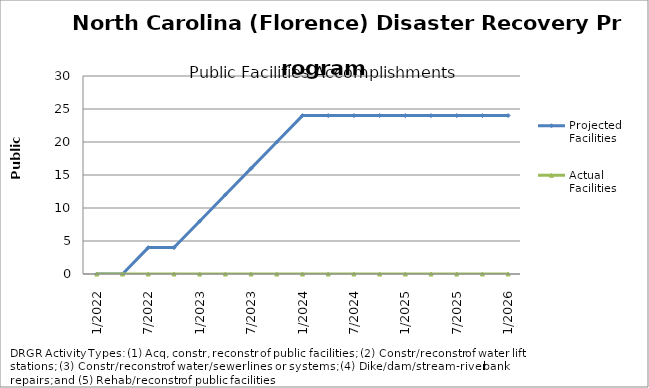
| Category | Projected Facilities | Actual Facilities |
|---|---|---|
| 1/2022 | 0 | 0 |
| 4/2022 | 0 | 0 |
| 7/2022 | 4 | 0 |
| 10/2022 | 4 | 0 |
| 1/2023 | 8 | 0 |
| 4/2023 | 12 | 0 |
| 7/2023 | 16 | 0 |
| 10/2023 | 20 | 0 |
| 1/2024 | 24 | 0 |
| 4/2024 | 24 | 0 |
| 7/2024 | 24 | 0 |
| 10/2024 | 24 | 0 |
| 1/2025 | 24 | 0 |
| 4/2025 | 24 | 0 |
| 7/2025 | 24 | 0 |
| 10/2025 | 24 | 0 |
| 1/2026 | 24 | 0 |